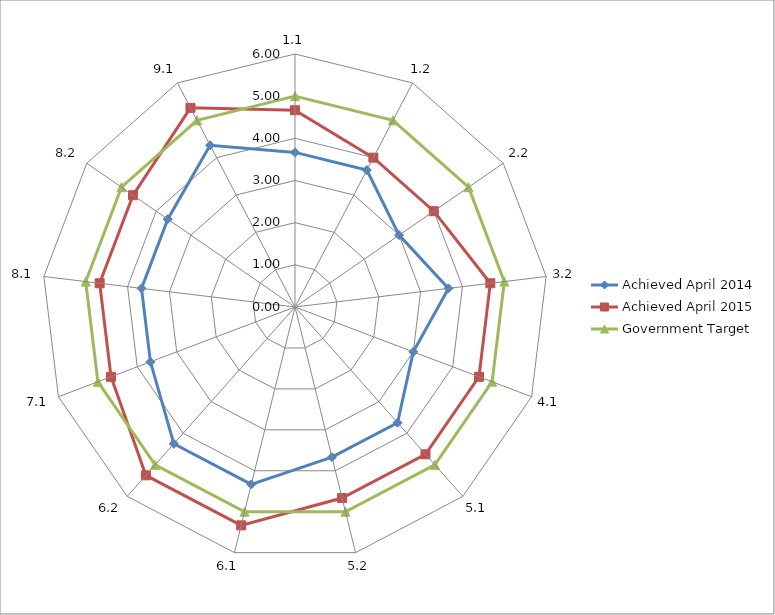
| Category | Achieved April 2014 | Achieved April 2015 | Government Target |
|---|---|---|---|
| 1.1 | 3.667 | 4.667 | 5 |
| 1.2 | 3.667 | 4 | 5 |
| 2.2 | 3 | 4 | 5 |
| 3.2 | 3.667 | 4.667 | 5 |
| 4.1 | 3 | 4.667 | 5 |
| 5.1 | 3.667 | 4.667 | 5 |
| 5.2 | 3.667 | 4.667 | 5 |
| 6.1 | 4.333 | 5.333 | 5 |
| 6.2 | 4.333 | 5.333 | 5 |
| 7.1 | 3.667 | 4.667 | 5 |
| 8.1 | 3.667 | 4.667 | 5 |
| 8.2 | 3.667 | 4.667 | 5 |
| 9.1 | 4.333 | 5.333 | 5 |